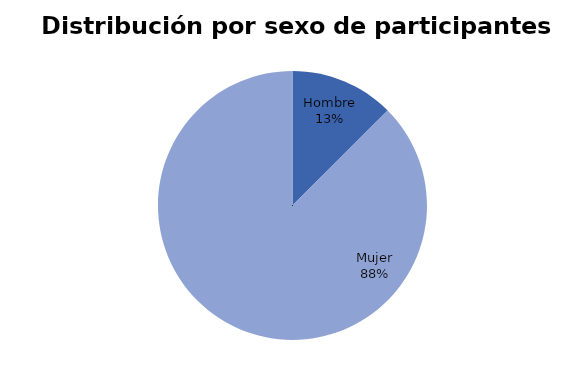
| Category | Series 0 |
|---|---|
| Hombre | 2 |
| Mujer | 14 |